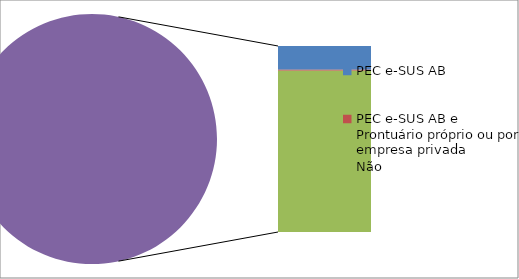
| Category | Series 0 |
|---|---|
| PEC e-SUS AB | 21 |
| PEC e-SUS AB e Prontuário próprio ou por empresa privada | 1 |
| Não | 143 |